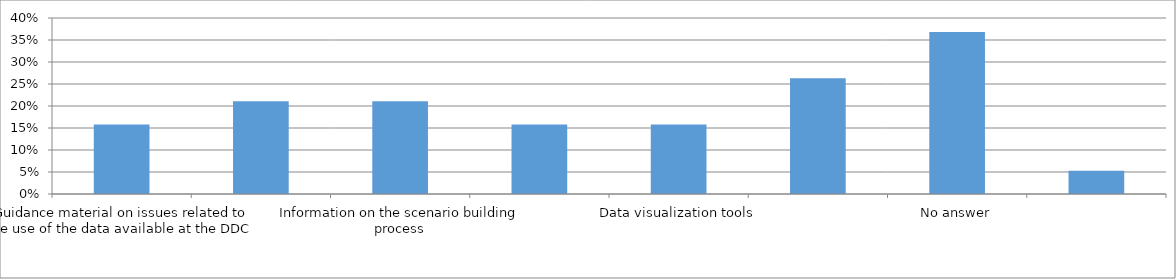
| Category | Series 0 |
|---|---|
| Guidance material on issues related to the use of the data available at the DDC | 0.158 |
| Guidance material providing more general information on data (available or not available from the DDC) in support of the work of the IPCC | 0.211 |
| Information on the scenario building process | 0.211 |
| Remote data analysis tools (making large downloads or shipments obsolete) | 0.158 |
| Data visualization tools | 0.158 |
| None | 0.263 |
| No answer | 0.368 |
| Ambiguous answer | 0.053 |